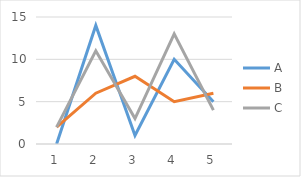
| Category | A | B | C |
|---|---|---|---|
| 0 | 0 | 2 | 2 |
| 1 | 14 | 6 | 11 |
| 2 | 1 | 8 | 3 |
| 3 | 10 | 5 | 13 |
| 4 | 5 | 6 | 4 |